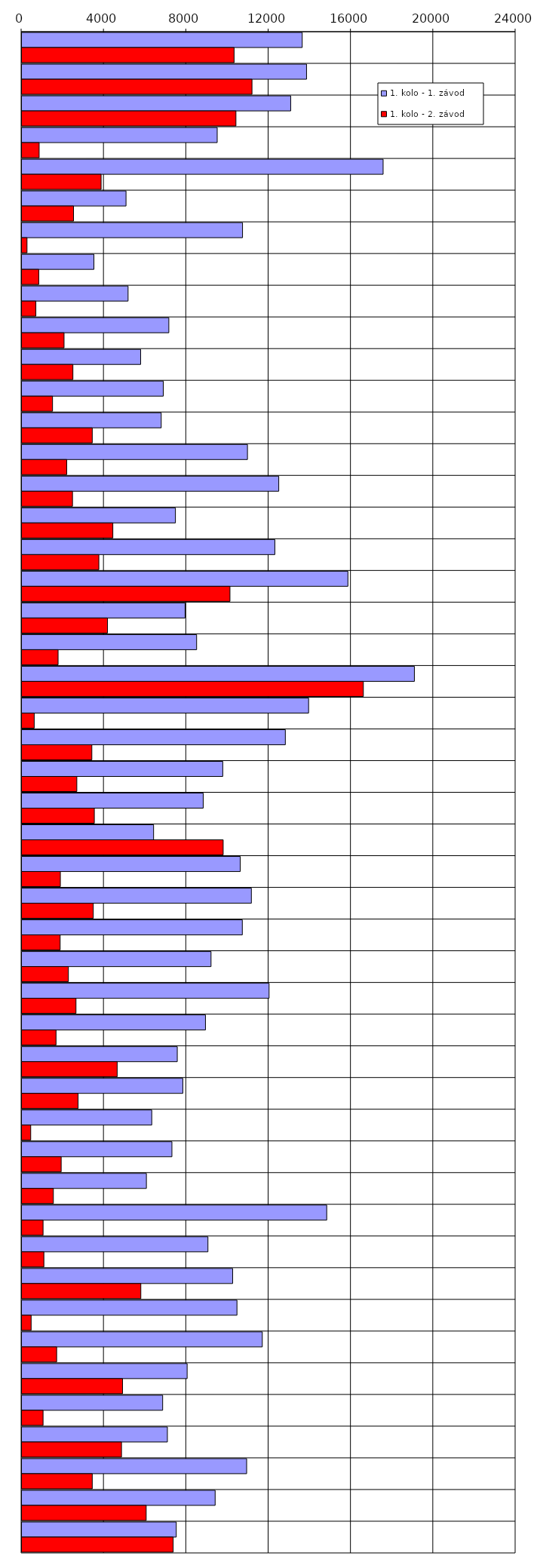
| Category | 1. kolo - 1. závod | 1. kolo - 2. závod |
|---|---|---|
| 0 | 13620 | 10310 |
| 1 | 13830 | 11180 |
| 2 | 13060 | 10400 |
| 3 | 9490 | 840 |
| 4 | 17550 | 3850 |
| 5 | 5060 | 2510 |
| 6 | 10720 | 250 |
| 7 | 3500 | 820 |
| 8 | 5160 | 680 |
| 9 | 7140 | 2050 |
| 10 | 5770 | 2480 |
| 11 | 6870 | 1490 |
| 12 | 6770 | 3420 |
| 13 | 10960 | 2180 |
| 14 | 12480 | 2460 |
| 15 | 7460 | 4420 |
| 16 | 12290 | 3740 |
| 17 | 15840 | 10110 |
| 18 | 7930 | 4160 |
| 19 | 8490 | 1760 |
| 20 | 19070 | 16590 |
| 21 | 13930 | 600 |
| 22 | 12800 | 3400 |
| 23 | 9760 | 2670 |
| 24 | 8810 | 3520 |
| 25 | 6400 | 9780 |
| 26 | 10610 | 1870 |
| 27 | 11150 | 3470 |
| 28 | 10710 | 1860 |
| 29 | 9190 | 2260 |
| 30 | 12010 | 2630 |
| 31 | 8920 | 1660 |
| 32 | 7550 | 4630 |
| 33 | 7820 | 2730 |
| 34 | 6310 | 430 |
| 35 | 7290 | 1910 |
| 36 | 6050 | 1530 |
| 37 | 14810 | 1030 |
| 38 | 9040 | 1070 |
| 39 | 10240 | 5780 |
| 40 | 10450 | 450 |
| 41 | 11680 | 1690 |
| 42 | 8030 | 4890 |
| 43 | 6840 | 1030 |
| 44 | 7070 | 4840 |
| 45 | 10920 | 3420 |
| 46 | 9390 | 6040 |
| 47 | 7500 | 7350 |